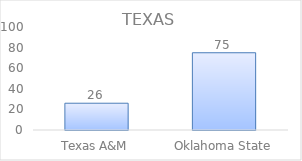
| Category | Series 0 |
|---|---|
| Texas A&M | 26 |
| Oklahoma State | 75 |